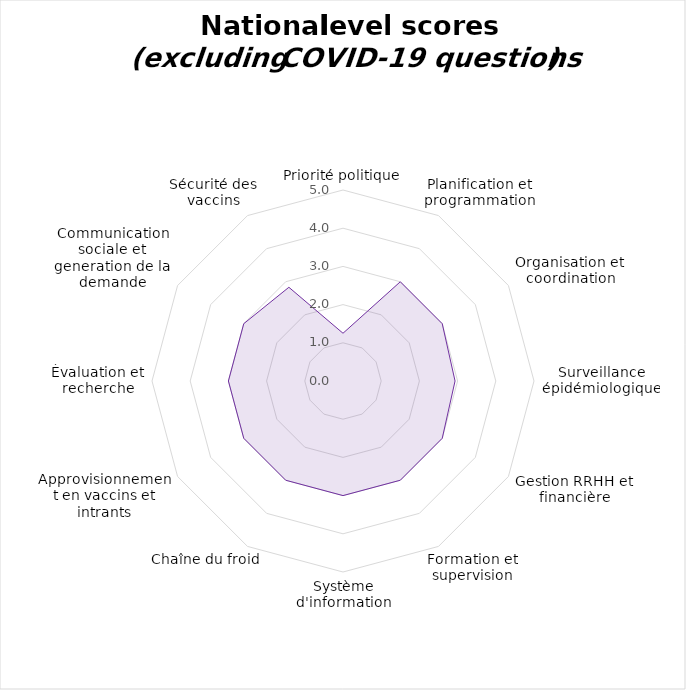
| Category | Scores moyens au niveau national (hors questions COVID-19) |
|---|---|
| Priorité politique | 1.25 |
| Planification et programmation | 3 |
| Organisation et coordination | 3 |
| Surveillance épidémiologique | 2.933 |
| Gestion RRHH et financière | 3 |
| Formation et supervision | 3 |
| Système d'information | 3 |
| Chaîne du froid | 3 |
| Approvisionnement en vaccins et intrants | 3 |
| Évaluation et recherche | 3 |
| Communication sociale et generation de la demande | 3 |
| Sécurité des vaccins | 2.833 |